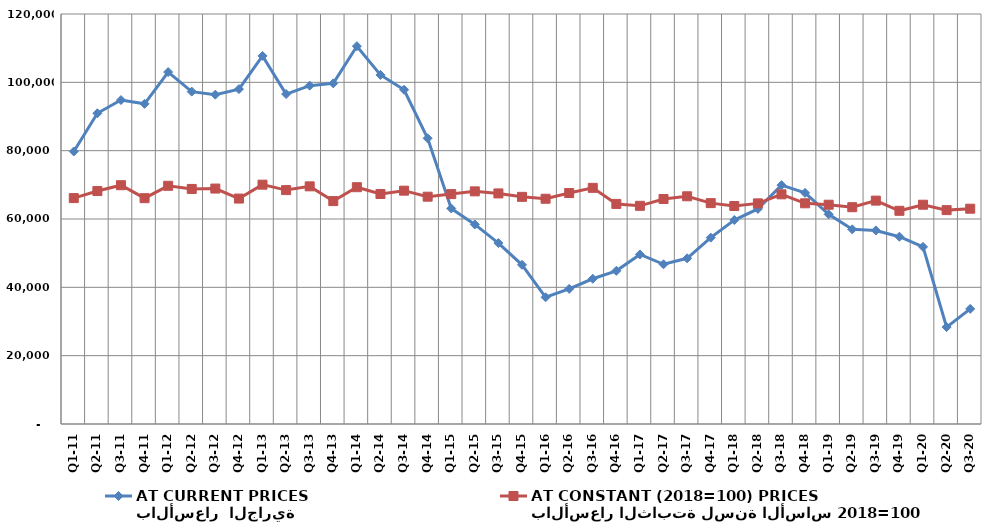
| Category | بالأسعار  الجارية 
AT CURRENT PRICES | بالأسعار الثابتة لسنة الأساس 2018=100
AT CONSTANT (2018=100) PRICES |
|---|---|---|
| Q1-11 | 79762.26 | 66115.635 |
| Q2-11 | 90934.534 | 68178.594 |
| Q3-11 | 94819.673 | 69888.529 |
| Q4-11 | 93710.543 | 66091.928 |
| Q1-12 | 103001.756 | 69713.748 |
| Q2-12 | 97282.582 | 68797.152 |
| Q3-12 | 96392.279 | 68911.805 |
| Q4-12 | 98020.285 | 65981.471 |
| Q1-13 | 107727.107 | 70051.709 |
| Q2-13 | 96563.811 | 68461.367 |
| Q3-13 | 99032.565 | 69555.177 |
| Q4-13 | 99707.049 | 65247.393 |
| Q1-14 | 110580.467 | 69308.867 |
| Q2-14 | 102169.527 | 67321.129 |
| Q3-14 | 97822.003 | 68292.762 |
| Q4-14 | 83617.712 | 66529.489 |
| Q1-15 | 63078.037 | 67287.655 |
| Q2-15 | 58407.079 | 68087.858 |
| Q3-15 | 52959.132 | 67481.844 |
| Q4-15 | 46597.085 | 66485.266 |
| Q1-16 | 37086.987 | 65926.21 |
| Q2-16 | 39550.427 | 67602.59 |
| Q3-16 | 42506.578 | 69119.923 |
| Q4-16 | 44839.556 | 64412.462 |
| Q1-17 | 49622.542 | 63855.238 |
| Q2-17 | 46742.453 | 65861.865 |
| Q3-17 | 48489.288 | 66647.955 |
| Q4-17 | 54550.908 | 64648.766 |
| Q1-18 | 59700.368 | 63803.741 |
| Q2-18 | 62954.883 | 64573.499 |
| Q3-18 | 69897.859 | 67222.372 |
| Q4-18 | 67644.564 | 64598.063 |
| Q1-19 | 61367.668 | 64178.48 |
| Q2-19 | 56973.562 | 63448.517 |
| Q3-19 | 56653.698 | 65382.493 |
| Q4-19 | 54807.721 | 62399.014 |
| Q1-20 | 51838.655 | 64178.215 |
| Q2-20 | 28361.846 | 62600.438 |
| Q3-20 | 33696.539 | 63011.92 |